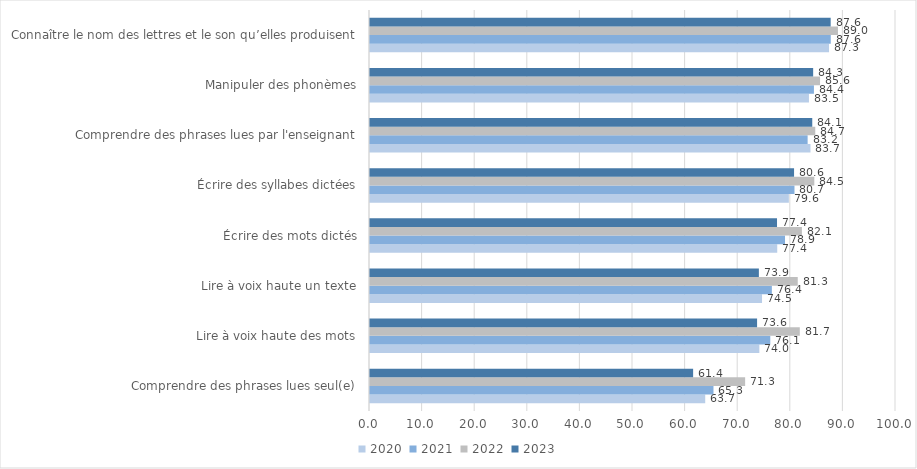
| Category | 2020 | 2021 | 2022 | 2023 |
|---|---|---|---|---|
| Comprendre des phrases lues seul(e) | 63.73 | 65.3 | 71.32 | 61.43 |
| Lire à voix haute des mots | 74.02 | 76.1 | 81.71 | 73.59 |
| Lire à voix haute un texte | 74.53 | 76.4 | 81.32 | 73.93 |
| Écrire des mots dictés | 77.42 | 78.9 | 82.11 | 77.38 |
| Écrire des syllabes dictées | 79.63 | 80.7 | 84.47 | 80.62 |
| Comprendre des phrases lues par l'enseignant | 83.74 | 83.2 | 84.65 | 84.08 |
| Manipuler des phonèmes | 83.45 | 84.4 | 85.56 | 84.25 |
| Connaître le nom des lettres et le son qu’elles produisent | 87.27 | 87.6 | 88.97 | 87.58 |